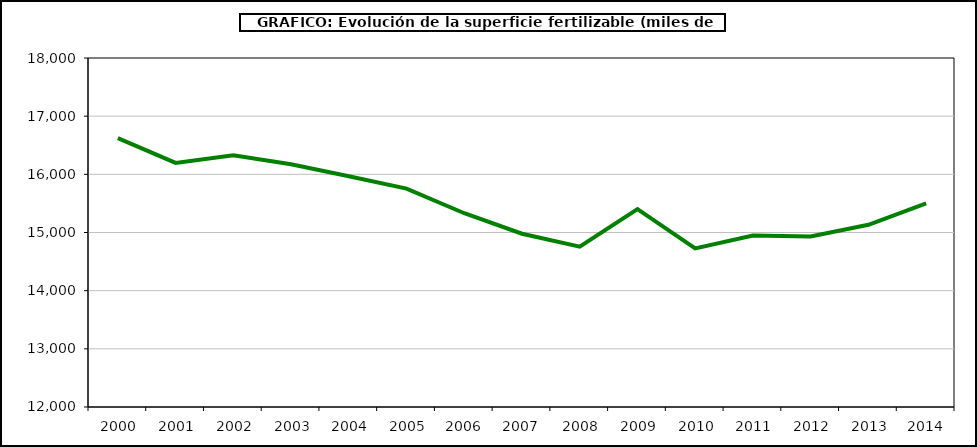
| Category | fertilizantes |
|---|---|
|   2000 | 16622 |
|   2001 | 16197 |
|   2002 | 16328 |
|   2003 | 16174 |
|   2004 | 15965.705 |
|   2005 | 15754.807 |
|   2006  | 15331.413 |
|   2007  | 14979.076 |
|   2008 | 14757 |
|   2009 | 15402 |
|   2010 | 14727 |
|   2011 | 14947 |
|   2012 | 14932 |
|   2013 | 15133 |
|  2014 | 15499 |